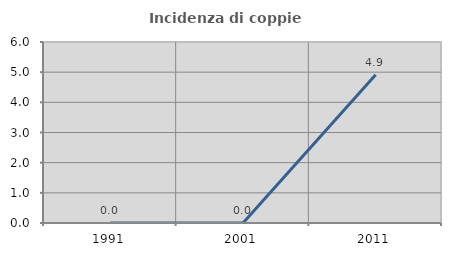
| Category | Incidenza di coppie miste |
|---|---|
| 1991.0 | 0 |
| 2001.0 | 0 |
| 2011.0 | 4.911 |